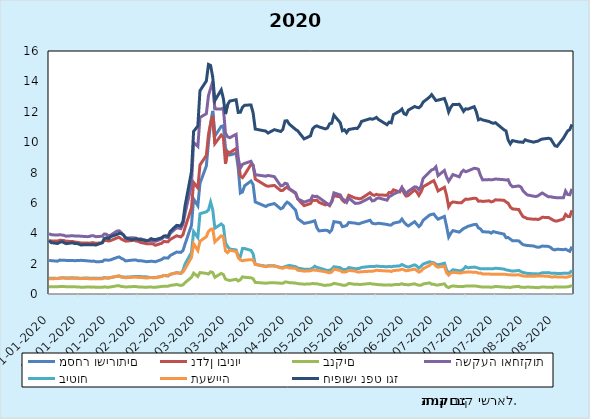
| Category | מסחר ושירותים | נדלן ובינוי | בנקים | השקעה ואחזקות | ביטוח | תעשייה | חיפושי נפט וגז |
|---|---|---|---|---|---|---|---|
| 2020-01-01 | 2.218 | 3.52 | 0.486 | 3.978 | 1.047 | 1.011 | 3.534 |
| 2020-01-02 | 2.195 | 3.485 | 0.48 | 3.903 | 1.035 | 1.005 | 3.383 |
| 2020-01-05 | 2.16 | 3.488 | 0.471 | 3.876 | 1.027 | 1.019 | 3.325 |
| 2020-01-06 | 2.231 | 3.538 | 0.494 | 3.905 | 1.039 | 1.056 | 3.4 |
| 2020-01-07 | 2.228 | 3.53 | 0.491 | 3.883 | 1.063 | 1.053 | 3.446 |
| 2020-01-08 | 2.229 | 3.52 | 0.49 | 3.862 | 1.062 | 1.057 | 3.381 |
| 2020-01-09 | 2.209 | 3.471 | 0.48 | 3.807 | 1.058 | 1.035 | 3.315 |
| 2020-01-12 | 2.21 | 3.457 | 0.483 | 3.838 | 1.063 | 1.038 | 3.373 |
| 2020-01-13 | 2.194 | 3.428 | 0.48 | 3.82 | 1.056 | 1.035 | 3.319 |
| 2020-01-14 | 2.201 | 3.403 | 0.464 | 3.81 | 1.047 | 1.029 | 3.323 |
| 2020-01-15 | 2.206 | 3.393 | 0.459 | 3.814 | 1.045 | 1.028 | 3.288 |
| 2020-01-16 | 2.217 | 3.356 | 0.448 | 3.804 | 1.042 | 1.012 | 3.229 |
| 2020-01-19 | 2.184 | 3.356 | 0.455 | 3.775 | 1.052 | 1.018 | 3.251 |
| 2020-01-20 | 2.168 | 3.346 | 0.463 | 3.789 | 1.042 | 1.002 | 3.235 |
| 2020-01-21 | 2.16 | 3.37 | 0.45 | 3.842 | 1.037 | 0.995 | 3.247 |
| 2020-01-22 | 2.166 | 3.374 | 0.458 | 3.83 | 1.046 | 1 | 3.247 |
| 2020-01-23 | 2.129 | 3.337 | 0.441 | 3.774 | 1.03 | 0.995 | 3.219 |
| 2020-01-26 | 2.133 | 3.371 | 0.442 | 3.805 | 1.04 | 1.004 | 3.378 |
| 2020-01-27 | 2.238 | 3.527 | 0.471 | 3.951 | 1.084 | 1.06 | 3.662 |
| 2020-01-28 | 2.235 | 3.525 | 0.453 | 3.933 | 1.056 | 1.055 | 3.702 |
| 2020-01-29 | 2.222 | 3.485 | 0.449 | 3.822 | 1.052 | 1.045 | 3.641 |
| 2020-01-30 | 2.251 | 3.52 | 0.467 | 3.876 | 1.084 | 1.083 | 3.779 |
| 2020-02-02 | 2.407 | 3.693 | 0.539 | 4.147 | 1.166 | 1.174 | 3.922 |
| 2020-02-03 | 2.441 | 3.733 | 0.543 | 4.159 | 1.184 | 1.183 | 3.999 |
| 2020-02-04 | 2.347 | 3.616 | 0.496 | 4.037 | 1.132 | 1.111 | 3.976 |
| 2020-02-05 | 2.283 | 3.548 | 0.484 | 3.877 | 1.122 | 1.097 | 3.891 |
| 2020-02-06 | 2.179 | 3.479 | 0.462 | 3.686 | 1.108 | 1.074 | 3.692 |
| 2020-02-09 | 2.228 | 3.519 | 0.485 | 3.702 | 1.136 | 1.096 | 3.568 |
| 2020-02-10 | 2.236 | 3.541 | 0.498 | 3.692 | 1.147 | 1.115 | 3.619 |
| 2020-02-11 | 2.234 | 3.49 | 0.488 | 3.678 | 1.145 | 1.104 | 3.632 |
| 2020-02-12 | 2.188 | 3.465 | 0.465 | 3.604 | 1.147 | 1.092 | 3.599 |
| 2020-02-13 | 2.195 | 3.393 | 0.465 | 3.635 | 1.147 | 1.093 | 3.576 |
| 2020-02-16 | 2.128 | 3.306 | 0.439 | 3.524 | 1.126 | 1.049 | 3.5 |
| 2020-02-17 | 2.144 | 3.307 | 0.464 | 3.511 | 1.097 | 1.073 | 3.544 |
| 2020-02-18 | 2.154 | 3.316 | 0.459 | 3.511 | 1.089 | 1.089 | 3.648 |
| 2020-02-19 | 2.146 | 3.292 | 0.444 | 3.475 | 1.085 | 1.068 | 3.595 |
| 2020-02-20 | 2.123 | 3.207 | 0.441 | 3.465 | 1.085 | 1.068 | 3.578 |
| 2020-02-23 | 2.271 | 3.339 | 0.497 | 3.629 | 1.16 | 1.161 | 3.702 |
| 2020-02-24 | 2.38 | 3.464 | 0.511 | 3.779 | 1.226 | 1.222 | 3.816 |
| 2020-02-25 | 2.372 | 3.441 | 0.501 | 3.744 | 1.206 | 1.194 | 3.834 |
| 2020-02-26 | 2.364 | 3.437 | 0.513 | 3.703 | 1.188 | 1.205 | 3.798 |
| 2020-02-27 | 2.532 | 3.593 | 0.564 | 3.99 | 1.285 | 1.306 | 4.122 |
| 2020-03-01 | 2.762 | 3.833 | 0.625 | 4.364 | 1.412 | 1.384 | 4.518 |
| 2020-03-03 | 2.739 | 3.758 | 0.562 | 4.306 | 1.355 | 1.376 | 4.487 |
| 2020-03-04 | 2.863 | 3.904 | 0.605 | 4.6 | 1.548 | 1.447 | 4.785 |
| 2020-03-05 | 3.297 | 4.372 | 0.752 | 5.306 | 1.986 | 1.664 | 5.82 |
| 2020-03-08 | 4.526 | 5.671 | 1.098 | 7.184 | 2.733 | 2.412 | 8.056 |
| 2020-03-09 | 6.259 | 7.345 | 1.372 | 9.979 | 4.116 | 3.312 | 10.701 |
| 2020-03-11 | 5.809 | 6.989 | 1.154 | 9.719 | 3.72 | 2.865 | 11.064 |
| 2020-03-12 | 7.287 | 8.5 | 1.414 | 11.624 | 5.287 | 3.468 | 13.384 |
| 2020-03-15 | 8.431 | 9.124 | 1.354 | 11.871 | 5.411 | 3.777 | 14.027 |
| 2020-03-16 | 9.971 | 10.514 | 1.316 | 13.069 | 5.533 | 4.12 | 15.114 |
| 2020-03-17 | 11.264 | 11.224 | 1.46 | 13.532 | 6.051 | 4.26 | 15.045 |
| 2020-03-18 | 12.058 | 11.738 | 1.415 | 13.989 | 5.55 | 4.283 | 14.286 |
| 2020-03-19 | 10.396 | 9.901 | 1.098 | 12.191 | 4.332 | 3.429 | 12.737 |
| 2020-03-22 | 11.039 | 10.465 | 1.358 | 12.174 | 4.612 | 3.828 | 13.435 |
| 2020-03-23 | 11.073 | 10.317 | 1.285 | 12.254 | 4.485 | 3.771 | 12.874 |
| 2020-03-24 | 9.625 | 8.576 | 0.981 | 10.596 | 3.358 | 2.839 | 11.852 |
| 2020-03-25 | 9.234 | 9.378 | 0.926 | 10.348 | 3.125 | 2.72 | 12.462 |
| 2020-03-26 | 9.148 | 9.302 | 0.89 | 10.291 | 2.958 | 2.884 | 12.703 |
| 2020-03-29 | 9.268 | 9.581 | 0.969 | 10.512 | 2.902 | 2.8 | 12.788 |
| 2020-03-30 | 8.282 | 8.843 | 0.861 | 8.921 | 2.49 | 2.393 | 11.957 |
| 2020-03-31 | 6.647 | 7.759 | 0.94 | 8.286 | 2.465 | 2.24 | 11.966 |
| 2020-04-01 | 6.722 | 7.662 | 1.131 | 8.534 | 2.993 | 2.186 | 12.295 |
| 2020-04-02 | 7.126 | 7.854 | 1.101 | 8.598 | 2.995 | 2.226 | 12.426 |
| 2020-04-05 | 7.441 | 8.533 | 1.067 | 8.737 | 2.87 | 2.258 | 12.448 |
| 2020-04-06 | 7.206 | 8.485 | 1.007 | 8.453 | 2.649 | 2.238 | 11.926 |
| 2020-04-07 | 6.061 | 7.566 | 0.763 | 7.855 | 1.952 | 1.947 | 10.86 |
| 2020-04-12 | 5.762 | 7.136 | 0.71 | 7.756 | 1.829 | 1.795 | 10.724 |
| 2020-04-13 | 5.853 | 7.096 | 0.731 | 7.808 | 1.859 | 1.832 | 10.596 |
| 2020-04-16 | 5.954 | 7.15 | 0.74 | 7.726 | 1.852 | 1.852 | 10.821 |
| 2020-04-19 | 5.605 | 6.808 | 0.71 | 7.119 | 1.743 | 1.716 | 10.702 |
| 2020-04-20 | 5.679 | 6.824 | 0.706 | 7.155 | 1.743 | 1.696 | 10.835 |
| 2020-04-21 | 5.897 | 6.959 | 0.793 | 7.295 | 1.807 | 1.76 | 11.394 |
| 2020-04-22 | 6.05 | 7.045 | 0.782 | 7.254 | 1.845 | 1.758 | 11.405 |
| 2020-04-23 | 5.962 | 6.905 | 0.748 | 6.944 | 1.879 | 1.716 | 11.188 |
| 2020-04-26 | 5.516 | 6.63 | 0.721 | 6.662 | 1.804 | 1.692 | 10.831 |
| 2020-04-27 | 4.962 | 6.252 | 0.686 | 6.272 | 1.71 | 1.566 | 10.742 |
| 2020-04-30 | 4.647 | 5.817 | 0.646 | 6.05 | 1.632 | 1.504 | 10.211 |
| 2020-05-03 | 4.734 | 5.953 | 0.667 | 6.193 | 1.634 | 1.527 | 10.414 |
| 2020-05-04 | 4.779 | 6.177 | 0.689 | 6.458 | 1.699 | 1.579 | 10.869 |
| 2020-05-05 | 4.823 | 6.156 | 0.678 | 6.42 | 1.83 | 1.571 | 11.014 |
| 2020-05-06 | 4.364 | 6.186 | 0.676 | 6.432 | 1.749 | 1.557 | 11.073 |
| 2020-05-07 | 4.156 | 6.034 | 0.641 | 6.345 | 1.719 | 1.532 | 11.005 |
| 2020-05-10 | 4.197 | 5.864 | 0.559 | 6.038 | 1.587 | 1.468 | 10.873 |
| 2020-05-11 | 4.179 | 5.914 | 0.599 | 5.936 | 1.543 | 1.422 | 10.93 |
| 2020-05-12 | 4.065 | 5.816 | 0.591 | 5.867 | 1.567 | 1.394 | 11.209 |
| 2020-05-13 | 4.222 | 6.073 | 0.632 | 6.091 | 1.638 | 1.448 | 11.249 |
| 2020-05-14 | 4.765 | 6.473 | 0.7 | 6.659 | 1.797 | 1.642 | 11.777 |
| 2020-05-17 | 4.699 | 6.396 | 0.622 | 6.523 | 1.732 | 1.546 | 11.276 |
| 2020-05-18 | 4.434 | 6.173 | 0.582 | 6.267 | 1.625 | 1.444 | 10.748 |
| 2020-05-19 | 4.464 | 6.053 | 0.567 | 6.175 | 1.613 | 1.441 | 10.811 |
| 2020-05-20 | 4.508 | 6.18 | 0.6 | 6.028 | 1.623 | 1.475 | 10.624 |
| 2020-05-21 | 4.711 | 6.5 | 0.7 | 6.318 | 1.742 | 1.552 | 10.831 |
| 2020-05-24 | 4.666 | 6.316 | 0.634 | 5.966 | 1.666 | 1.514 | 10.908 |
| 2020-05-25 | 4.632 | 6.297 | 0.65 | 5.969 | 1.669 | 1.456 | 10.902 |
| 2020-05-26 | 4.624 | 6.263 | 0.621 | 5.989 | 1.688 | 1.45 | 11.066 |
| 2020-05-27 | 4.684 | 6.299 | 0.634 | 6.049 | 1.749 | 1.467 | 11.361 |
| 2020-05-31 | 4.856 | 6.67 | 0.689 | 6.342 | 1.814 | 1.498 | 11.543 |
| 2020-06-01 | 4.664 | 6.542 | 0.658 | 6.128 | 1.807 | 1.497 | 11.507 |
| 2020-06-02 | 4.628 | 6.495 | 0.647 | 6.153 | 1.807 | 1.525 | 11.547 |
| 2020-06-03 | 4.631 | 6.563 | 0.632 | 6.28 | 1.843 | 1.562 | 11.627 |
| 2020-06-04 | 4.66 | 6.52 | 0.614 | 6.323 | 1.823 | 1.552 | 11.489 |
| 2020-06-08 | 4.58 | 6.503 | 0.585 | 6.177 | 1.795 | 1.515 | 11.146 |
| 2020-06-09 | 4.542 | 6.688 | 0.606 | 6.415 | 1.813 | 1.521 | 11.317 |
| 2020-06-10 | 4.543 | 6.669 | 0.581 | 6.474 | 1.792 | 1.478 | 11.271 |
| 2020-06-11 | 4.663 | 6.857 | 0.613 | 6.576 | 1.821 | 1.541 | 11.812 |
| 2020-06-14 | 4.754 | 6.719 | 0.633 | 6.767 | 1.852 | 1.578 | 12.045 |
| 2020-06-15 | 4.931 | 6.997 | 0.677 | 7.013 | 1.942 | 1.631 | 12.178 |
| 2020-06-16 | 4.732 | 6.64 | 0.627 | 6.824 | 1.871 | 1.586 | 11.87 |
| 2020-06-17 | 4.575 | 6.445 | 0.624 | 6.574 | 1.806 | 1.526 | 11.812 |
| 2020-06-18 | 4.483 | 6.49 | 0.6 | 6.766 | 1.774 | 1.552 | 12.103 |
| 2020-06-21 | 4.761 | 6.862 | 0.672 | 7.056 | 1.92 | 1.639 | 12.347 |
| 2020-06-22 | 4.594 | 6.715 | 0.614 | 7.032 | 1.846 | 1.547 | 12.29 |
| 2020-06-23 | 4.44 | 6.493 | 0.582 | 6.869 | 1.709 | 1.44 | 12.262 |
| 2020-06-24 | 4.585 | 6.722 | 0.578 | 7.093 | 1.83 | 1.51 | 12.383 |
| 2020-06-25 | 4.853 | 7.062 | 0.659 | 7.621 | 1.97 | 1.666 | 12.635 |
| 2020-06-28 | 5.194 | 7.305 | 0.732 | 8.04 | 2.124 | 1.88 | 12.966 |
| 2020-06-29 | 5.243 | 7.395 | 0.647 | 8.168 | 2.076 | 2.003 | 13.127 |
| 2020-06-30 | 5.267 | 7.464 | 0.64 | 8.22 | 2.062 | 2.005 | 12.932 |
| 2020-07-01 | 5.079 | 7.153 | 0.593 | 8.373 | 1.964 | 1.833 | 12.737 |
| 2020-07-02 | 4.923 | 6.786 | 0.592 | 7.794 | 1.915 | 1.766 | 12.765 |
| 2020-07-05 | 5.11 | 7.027 | 0.668 | 8.132 | 2.029 | 1.837 | 12.875 |
| 2020-07-06 | 4.471 | 6.506 | 0.49 | 7.714 | 1.603 | 1.395 | 12.5 |
| 2020-07-07 | 3.753 | 5.746 | 0.422 | 7.425 | 1.363 | 1.246 | 11.986 |
| 2020-07-08 | 3.998 | 5.974 | 0.499 | 7.643 | 1.48 | 1.379 | 12.293 |
| 2020-07-09 | 4.177 | 6.062 | 0.53 | 7.865 | 1.598 | 1.428 | 12.477 |
| 2020-07-12 | 4.075 | 6.003 | 0.486 | 7.715 | 1.529 | 1.386 | 12.488 |
| 2020-07-13 | 4.189 | 6.003 | 0.487 | 8.007 | 1.545 | 1.391 | 12.273 |
| 2020-07-14 | 4.313 | 6.137 | 0.5 | 8.146 | 1.647 | 1.435 | 12.026 |
| 2020-07-15 | 4.373 | 6.252 | 0.518 | 8.05 | 1.802 | 1.438 | 12.193 |
| 2020-07-16 | 4.452 | 6.232 | 0.529 | 8.097 | 1.727 | 1.449 | 12.17 |
| 2020-07-19 | 4.576 | 6.306 | 0.524 | 8.278 | 1.772 | 1.434 | 12.334 |
| 2020-07-20 | 4.584 | 6.292 | 0.518 | 8.262 | 1.748 | 1.433 | 12.004 |
| 2020-07-21 | 4.353 | 6.11 | 0.496 | 8.209 | 1.698 | 1.372 | 11.469 |
| 2020-07-22 | 4.282 | 6.121 | 0.473 | 7.798 | 1.658 | 1.377 | 11.53 |
| 2020-07-23 | 4.099 | 6.095 | 0.458 | 7.514 | 1.657 | 1.321 | 11.46 |
| 2020-07-26 | 4.078 | 6.136 | 0.455 | 7.533 | 1.661 | 1.313 | 11.358 |
| 2020-07-27 | 4.008 | 6.067 | 0.448 | 7.517 | 1.653 | 1.303 | 11.286 |
| 2020-07-28 | 4.114 | 6.102 | 0.46 | 7.535 | 1.664 | 1.303 | 11.239 |
| 2020-07-29 | 4.069 | 6.201 | 0.499 | 7.572 | 1.697 | 1.306 | 11.28 |
| 2020-08-02 | 3.944 | 6.173 | 0.456 | 7.526 | 1.643 | 1.304 | 10.816 |
| 2020-08-03 | 3.707 | 6.06 | 0.446 | 7.503 | 1.588 | 1.29 | 10.735 |
| 2020-08-04 | 3.717 | 5.976 | 0.443 | 7.525 | 1.563 | 1.265 | 10.143 |
| 2020-08-05 | 3.617 | 5.728 | 0.428 | 7.2 | 1.533 | 1.261 | 9.885 |
| 2020-08-06 | 3.509 | 5.603 | 0.466 | 7.06 | 1.505 | 1.255 | 10.101 |
| 2020-08-09 | 3.497 | 5.561 | 0.505 | 7.114 | 1.55 | 1.262 | 10.011 |
| 2020-08-10 | 3.36 | 5.304 | 0.439 | 7.046 | 1.475 | 1.224 | 10.005 |
| 2020-08-11 | 3.25 | 5.093 | 0.439 | 6.8 | 1.413 | 1.195 | 9.984 |
| 2020-08-12 | 3.218 | 5.034 | 0.435 | 6.657 | 1.389 | 1.174 | 10.155 |
| 2020-08-13 | 3.196 | 4.964 | 0.459 | 6.525 | 1.356 | 1.164 | 10.098 |
| 2020-08-16 | 3.162 | 4.922 | 0.437 | 6.44 | 1.333 | 1.171 | 9.996 |
| 2020-08-17 | 3.107 | 4.934 | 0.43 | 6.42 | 1.335 | 1.177 | 10.041 |
| 2020-08-18 | 3.08 | 4.901 | 0.413 | 6.464 | 1.316 | 1.183 | 10.062 |
| 2020-08-19 | 3.093 | 4.955 | 0.445 | 6.561 | 1.351 | 1.178 | 10.146 |
| 2020-08-20 | 3.156 | 5.049 | 0.456 | 6.651 | 1.397 | 1.182 | 10.201 |
| 2020-08-23 | 3.133 | 5.038 | 0.449 | 6.396 | 1.409 | 1.164 | 10.255 |
| 2020-08-24 | 3.06 | 4.959 | 0.446 | 6.404 | 1.375 | 1.129 | 10.213 |
| 2020-08-25 | 2.937 | 4.875 | 0.434 | 6.369 | 1.361 | 1.119 | 9.987 |
| 2020-08-26 | 2.903 | 4.813 | 0.474 | 6.355 | 1.369 | 1.146 | 9.763 |
| 2020-08-27 | 2.951 | 4.803 | 0.454 | 6.33 | 1.352 | 1.124 | 9.722 |
| 2020-08-30 | 2.918 | 4.94 | 0.46 | 6.337 | 1.36 | 1.115 | 10.262 |
| 2020-08-31 | 2.953 | 5.241 | 0.463 | 6.777 | 1.376 | 1.104 | 10.504 |
| 2020-09-01 | 2.877 | 5.109 | 0.476 | 6.549 | 1.362 | 1.125 | 10.735 |
| 2020-09-02 | 2.811 | 5.101 | 0.498 | 6.533 | 1.392 | 1.16 | 10.825 |
| 2020-09-03 | 3.124 | 5.516 | 0.572 | 6.924 | 1.555 | 1.248 | 11.17 |